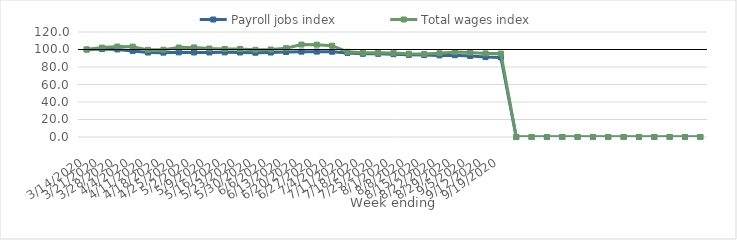
| Category | Payroll jobs index | Total wages index |
|---|---|---|
| 14/03/2020 | 100 | 100 |
| 21/03/2020 | 100.503 | 102.162 |
| 28/03/2020 | 100.072 | 103.358 |
| 04/04/2020 | 98.416 | 103.219 |
| 11/04/2020 | 96.553 | 99.582 |
| 18/04/2020 | 96.416 | 99.753 |
| 25/04/2020 | 96.716 | 102.228 |
| 02/05/2020 | 96.605 | 102.366 |
| 09/05/2020 | 96.619 | 101.081 |
| 16/05/2020 | 96.726 | 100.649 |
| 23/05/2020 | 96.599 | 100.548 |
| 30/05/2020 | 96.299 | 99.608 |
| 06/06/2020 | 96.557 | 99.968 |
| 13/06/2020 | 97.145 | 101.531 |
| 20/06/2020 | 97.515 | 105.643 |
| 27/06/2020 | 97.571 | 105.544 |
| 04/07/2020 | 97.44 | 104.311 |
| 11/07/2020 | 96.076 | 97.374 |
| 18/07/2020 | 95.073 | 96.283 |
| 25/07/2020 | 95.064 | 96.172 |
| 01/08/2020 | 94.614 | 96.111 |
| 08/08/2020 | 93.862 | 95.207 |
| 15/08/2020 | 93.581 | 94.822 |
| 22/08/2020 | 93.28 | 95.711 |
| 29/08/2020 | 93.463 | 97.055 |
| 05/09/2020 | 92.544 | 96.525 |
| 12/09/2020 | 91.369 | 95.521 |
| 19/09/2020 | 90.933 | 95.323 |